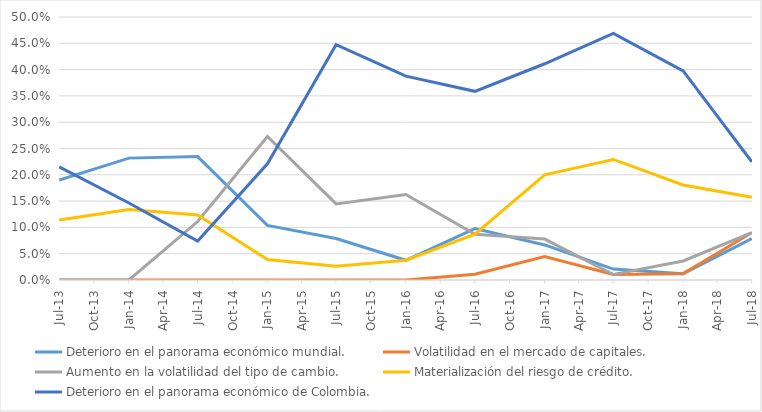
| Category | Deterioro en el panorama económico mundial. | Volatilidad en el mercado de capitales. | Aumento en la volatilidad del tipo de cambio. | Materialización del riesgo de crédito. | Deterioro en el panorama económico de Colombia. |
|---|---|---|---|---|---|
| 2013-07-01 | 0.19 | 0 | 0 | 0.114 | 0.215 |
| 2014-01-01 | 0.232 | 0 | 0 | 0.134 | 0.146 |
| 2014-07-01 | 0.235 | 0 | 0.111 | 0.123 | 0.074 |
| 2015-01-01 | 0.104 | 0 | 0.273 | 0.039 | 0.221 |
| 2015-07-01 | 0.079 | 0 | 0.145 | 0.026 | 0.447 |
| 2016-01-01 | 0.038 | 0 | 0.162 | 0.038 | 0.388 |
| 2016-07-01 | 0.098 | 0.011 | 0.087 | 0.087 | 0.359 |
| 2017-01-01 | 0.067 | 0.044 | 0.078 | 0.2 | 0.411 |
| 2017-07-01 | 0.021 | 0.01 | 0.01 | 0.229 | 0.469 |
| 2018-01-01 | 0.012 | 0.012 | 0.036 | 0.181 | 0.398 |
| 2018-07-01 | 0.079 | 0.09 | 0.09 | 0.157 | 0.225 |